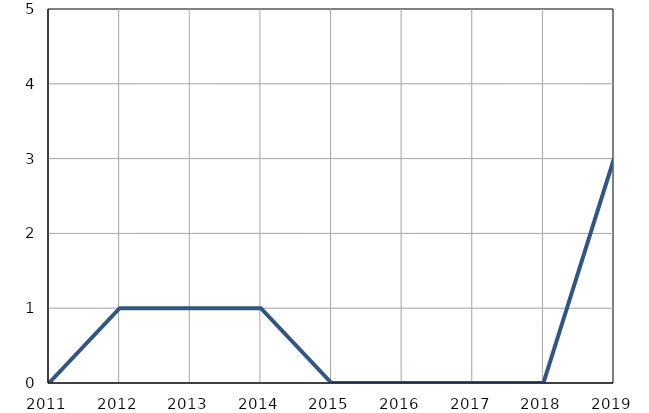
| Category | Умрла 
одојчад |
|---|---|
| 2011.0 | 0 |
| 2012.0 | 1 |
| 2013.0 | 1 |
| 2014.0 | 1 |
| 2015.0 | 0 |
| 2016.0 | 0 |
| 2017.0 | 0 |
| 2018.0 | 0 |
| 2019.0 | 3 |